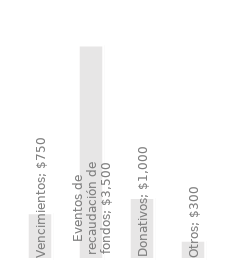
| Category | Ingresos anuales |
|---|---|
| Vencimientos | 750 |
| Eventos de recaudación de fondos | 3500 |
| Donativos | 1000 |
| Otros | 300 |